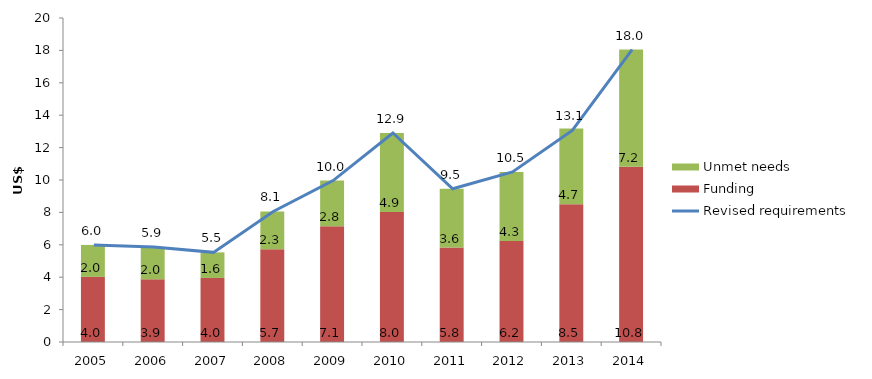
| Category | Funding  | Unmet needs  |
|---|---|---|
| 2005.0 | 4.021 | 1.971 |
| 2006.0 | 3.868 | 1.995 |
| 2007.0 | 3.953 | 1.58 |
| 2008.0 | 5.732 | 2.327 |
| 2009.0 | 7.143 | 2.822 |
| 2010.0 | 8.028 | 4.872 |
| 2011.0 | 5.83 | 3.629 |
| 2012.0 | 6.24 | 4.255 |
| 2013.0 | 8.508 | 4.669 |
| 2014.0 | 10.813 | 7.236 |